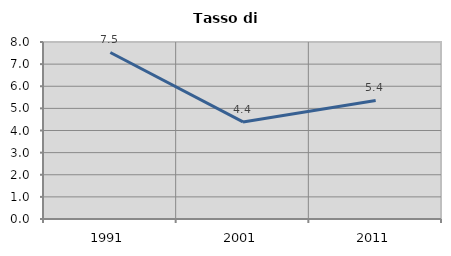
| Category | Tasso di disoccupazione   |
|---|---|
| 1991.0 | 7.527 |
| 2001.0 | 4.389 |
| 2011.0 | 5.357 |